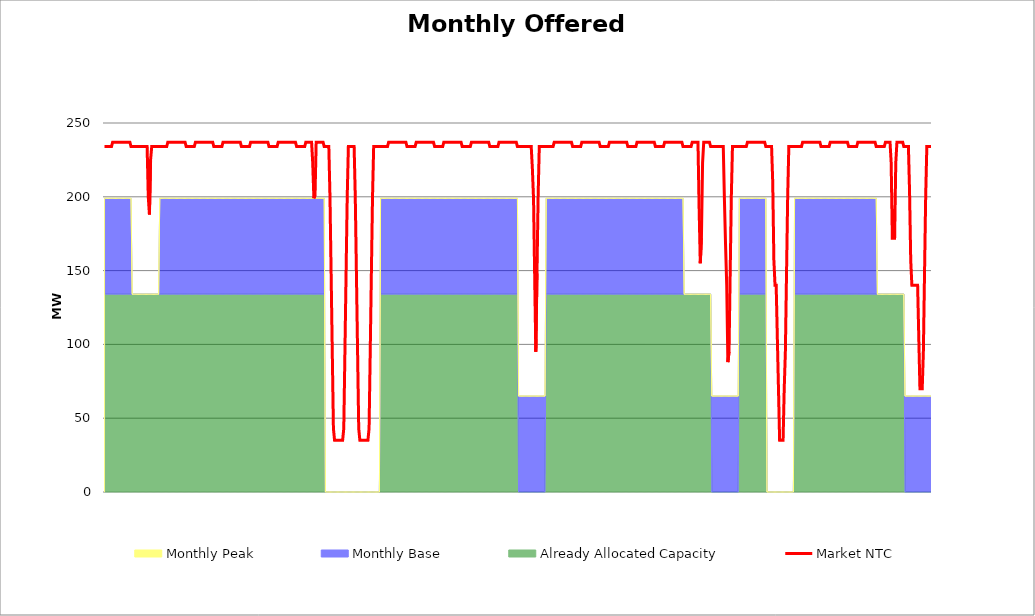
| Category | Market NTC |
|---|---|
| 0 | 234 |
| 1 | 234 |
| 2 | 234 |
| 3 | 234 |
| 4 | 234 |
| 5 | 234 |
| 6 | 234 |
| 7 | 237 |
| 8 | 237 |
| 9 | 237 |
| 10 | 237 |
| 11 | 237 |
| 12 | 237 |
| 13 | 237 |
| 14 | 237 |
| 15 | 237 |
| 16 | 237 |
| 17 | 237 |
| 18 | 237 |
| 19 | 237 |
| 20 | 237 |
| 21 | 237 |
| 22 | 237 |
| 23 | 234 |
| 24 | 234 |
| 25 | 234 |
| 26 | 234 |
| 27 | 234 |
| 28 | 234 |
| 29 | 234 |
| 30 | 234 |
| 31 | 234 |
| 32 | 234 |
| 33 | 234 |
| 34 | 234 |
| 35 | 234 |
| 36 | 234 |
| 37 | 234 |
| 38 | 200 |
| 39 | 188 |
| 40 | 225 |
| 41 | 234 |
| 42 | 234 |
| 43 | 234 |
| 44 | 234 |
| 45 | 234 |
| 46 | 234 |
| 47 | 234 |
| 48 | 234 |
| 49 | 234 |
| 50 | 234 |
| 51 | 234 |
| 52 | 234 |
| 53 | 234 |
| 54 | 234 |
| 55 | 237 |
| 56 | 237 |
| 57 | 237 |
| 58 | 237 |
| 59 | 237 |
| 60 | 237 |
| 61 | 237 |
| 62 | 237 |
| 63 | 237 |
| 64 | 237 |
| 65 | 237 |
| 66 | 237 |
| 67 | 237 |
| 68 | 237 |
| 69 | 237 |
| 70 | 237 |
| 71 | 234 |
| 72 | 234 |
| 73 | 234 |
| 74 | 234 |
| 75 | 234 |
| 76 | 234 |
| 77 | 234 |
| 78 | 234 |
| 79 | 237 |
| 80 | 237 |
| 81 | 237 |
| 82 | 237 |
| 83 | 237 |
| 84 | 237 |
| 85 | 237 |
| 86 | 237 |
| 87 | 237 |
| 88 | 237 |
| 89 | 237 |
| 90 | 237 |
| 91 | 237 |
| 92 | 237 |
| 93 | 237 |
| 94 | 237 |
| 95 | 234 |
| 96 | 234 |
| 97 | 234 |
| 98 | 234 |
| 99 | 234 |
| 100 | 234 |
| 101 | 234 |
| 102 | 234 |
| 103 | 237 |
| 104 | 237 |
| 105 | 237 |
| 106 | 237 |
| 107 | 237 |
| 108 | 237 |
| 109 | 237 |
| 110 | 237 |
| 111 | 237 |
| 112 | 237 |
| 113 | 237 |
| 114 | 237 |
| 115 | 237 |
| 116 | 237 |
| 117 | 237 |
| 118 | 237 |
| 119 | 234 |
| 120 | 234 |
| 121 | 234 |
| 122 | 234 |
| 123 | 234 |
| 124 | 234 |
| 125 | 234 |
| 126 | 234 |
| 127 | 237 |
| 128 | 237 |
| 129 | 237 |
| 130 | 237 |
| 131 | 237 |
| 132 | 237 |
| 133 | 237 |
| 134 | 237 |
| 135 | 237 |
| 136 | 237 |
| 137 | 237 |
| 138 | 237 |
| 139 | 237 |
| 140 | 237 |
| 141 | 237 |
| 142 | 237 |
| 143 | 234 |
| 144 | 234 |
| 145 | 234 |
| 146 | 234 |
| 147 | 234 |
| 148 | 234 |
| 149 | 234 |
| 150 | 234 |
| 151 | 237 |
| 152 | 237 |
| 153 | 237 |
| 154 | 237 |
| 155 | 237 |
| 156 | 237 |
| 157 | 237 |
| 158 | 237 |
| 159 | 237 |
| 160 | 237 |
| 161 | 237 |
| 162 | 237 |
| 163 | 237 |
| 164 | 237 |
| 165 | 237 |
| 166 | 237 |
| 167 | 234 |
| 168 | 234 |
| 169 | 234 |
| 170 | 234 |
| 171 | 234 |
| 172 | 234 |
| 173 | 234 |
| 174 | 234 |
| 175 | 237 |
| 176 | 237 |
| 177 | 237 |
| 178 | 237 |
| 179 | 237 |
| 180 | 237 |
| 181 | 223 |
| 182 | 199 |
| 183 | 201 |
| 184 | 237 |
| 185 | 237 |
| 186 | 237 |
| 187 | 237 |
| 188 | 237 |
| 189 | 237 |
| 190 | 237 |
| 191 | 234 |
| 192 | 234 |
| 193 | 234 |
| 194 | 234 |
| 195 | 234 |
| 196 | 200 |
| 197 | 148 |
| 198 | 95 |
| 199 | 43 |
| 200 | 35 |
| 201 | 35 |
| 202 | 35 |
| 203 | 35 |
| 204 | 35 |
| 205 | 35 |
| 206 | 35 |
| 207 | 35 |
| 208 | 43 |
| 209 | 95 |
| 210 | 148 |
| 211 | 200 |
| 212 | 234 |
| 213 | 234 |
| 214 | 234 |
| 215 | 234 |
| 216 | 234 |
| 217 | 234 |
| 218 | 200 |
| 219 | 148 |
| 220 | 95 |
| 221 | 43 |
| 222 | 35 |
| 223 | 35 |
| 224 | 35 |
| 225 | 35 |
| 226 | 35 |
| 227 | 35 |
| 228 | 35 |
| 229 | 35 |
| 230 | 43 |
| 231 | 95 |
| 232 | 148 |
| 233 | 200 |
| 234 | 234 |
| 235 | 234 |
| 236 | 234 |
| 237 | 234 |
| 238 | 234 |
| 239 | 234 |
| 240 | 234 |
| 241 | 234 |
| 242 | 234 |
| 243 | 234 |
| 244 | 234 |
| 245 | 234 |
| 246 | 234 |
| 247 | 237 |
| 248 | 237 |
| 249 | 237 |
| 250 | 237 |
| 251 | 237 |
| 252 | 237 |
| 253 | 237 |
| 254 | 237 |
| 255 | 237 |
| 256 | 237 |
| 257 | 237 |
| 258 | 237 |
| 259 | 237 |
| 260 | 237 |
| 261 | 237 |
| 262 | 237 |
| 263 | 234 |
| 264 | 234 |
| 265 | 234 |
| 266 | 234 |
| 267 | 234 |
| 268 | 234 |
| 269 | 234 |
| 270 | 234 |
| 271 | 237 |
| 272 | 237 |
| 273 | 237 |
| 274 | 237 |
| 275 | 237 |
| 276 | 237 |
| 277 | 237 |
| 278 | 237 |
| 279 | 237 |
| 280 | 237 |
| 281 | 237 |
| 282 | 237 |
| 283 | 237 |
| 284 | 237 |
| 285 | 237 |
| 286 | 237 |
| 287 | 234 |
| 288 | 234 |
| 289 | 234 |
| 290 | 234 |
| 291 | 234 |
| 292 | 234 |
| 293 | 234 |
| 294 | 234 |
| 295 | 237 |
| 296 | 237 |
| 297 | 237 |
| 298 | 237 |
| 299 | 237 |
| 300 | 237 |
| 301 | 237 |
| 302 | 237 |
| 303 | 237 |
| 304 | 237 |
| 305 | 237 |
| 306 | 237 |
| 307 | 237 |
| 308 | 237 |
| 309 | 237 |
| 310 | 237 |
| 311 | 234 |
| 312 | 234 |
| 313 | 234 |
| 314 | 234 |
| 315 | 234 |
| 316 | 234 |
| 317 | 234 |
| 318 | 234 |
| 319 | 237 |
| 320 | 237 |
| 321 | 237 |
| 322 | 237 |
| 323 | 237 |
| 324 | 237 |
| 325 | 237 |
| 326 | 237 |
| 327 | 237 |
| 328 | 237 |
| 329 | 237 |
| 330 | 237 |
| 331 | 237 |
| 332 | 237 |
| 333 | 237 |
| 334 | 237 |
| 335 | 234 |
| 336 | 234 |
| 337 | 234 |
| 338 | 234 |
| 339 | 234 |
| 340 | 234 |
| 341 | 234 |
| 342 | 234 |
| 343 | 237 |
| 344 | 237 |
| 345 | 237 |
| 346 | 237 |
| 347 | 237 |
| 348 | 237 |
| 349 | 237 |
| 350 | 237 |
| 351 | 237 |
| 352 | 237 |
| 353 | 237 |
| 354 | 237 |
| 355 | 237 |
| 356 | 237 |
| 357 | 237 |
| 358 | 237 |
| 359 | 234 |
| 360 | 234 |
| 361 | 234 |
| 362 | 234 |
| 363 | 234 |
| 364 | 234 |
| 365 | 234 |
| 366 | 234 |
| 367 | 234 |
| 368 | 234 |
| 369 | 234 |
| 370 | 234 |
| 371 | 234 |
| 372 | 219 |
| 373 | 199 |
| 374 | 146 |
| 375 | 95 |
| 376 | 148 |
| 377 | 200 |
| 378 | 234 |
| 379 | 234 |
| 380 | 234 |
| 381 | 234 |
| 382 | 234 |
| 383 | 234 |
| 384 | 234 |
| 385 | 234 |
| 386 | 234 |
| 387 | 234 |
| 388 | 234 |
| 389 | 234 |
| 390 | 234 |
| 391 | 237 |
| 392 | 237 |
| 393 | 237 |
| 394 | 237 |
| 395 | 237 |
| 396 | 237 |
| 397 | 237 |
| 398 | 237 |
| 399 | 237 |
| 400 | 237 |
| 401 | 237 |
| 402 | 237 |
| 403 | 237 |
| 404 | 237 |
| 405 | 237 |
| 406 | 237 |
| 407 | 234 |
| 408 | 234 |
| 409 | 234 |
| 410 | 234 |
| 411 | 234 |
| 412 | 234 |
| 413 | 234 |
| 414 | 234 |
| 415 | 237 |
| 416 | 237 |
| 417 | 237 |
| 418 | 237 |
| 419 | 237 |
| 420 | 237 |
| 421 | 237 |
| 422 | 237 |
| 423 | 237 |
| 424 | 237 |
| 425 | 237 |
| 426 | 237 |
| 427 | 237 |
| 428 | 237 |
| 429 | 237 |
| 430 | 237 |
| 431 | 234 |
| 432 | 234 |
| 433 | 234 |
| 434 | 234 |
| 435 | 234 |
| 436 | 234 |
| 437 | 234 |
| 438 | 234 |
| 439 | 237 |
| 440 | 237 |
| 441 | 237 |
| 442 | 237 |
| 443 | 237 |
| 444 | 237 |
| 445 | 237 |
| 446 | 237 |
| 447 | 237 |
| 448 | 237 |
| 449 | 237 |
| 450 | 237 |
| 451 | 237 |
| 452 | 237 |
| 453 | 237 |
| 454 | 237 |
| 455 | 234 |
| 456 | 234 |
| 457 | 234 |
| 458 | 234 |
| 459 | 234 |
| 460 | 234 |
| 461 | 234 |
| 462 | 234 |
| 463 | 237 |
| 464 | 237 |
| 465 | 237 |
| 466 | 237 |
| 467 | 237 |
| 468 | 237 |
| 469 | 237 |
| 470 | 237 |
| 471 | 237 |
| 472 | 237 |
| 473 | 237 |
| 474 | 237 |
| 475 | 237 |
| 476 | 237 |
| 477 | 237 |
| 478 | 237 |
| 479 | 234 |
| 480 | 234 |
| 481 | 234 |
| 482 | 234 |
| 483 | 234 |
| 484 | 234 |
| 485 | 234 |
| 486 | 234 |
| 487 | 237 |
| 488 | 237 |
| 489 | 237 |
| 490 | 237 |
| 491 | 237 |
| 492 | 237 |
| 493 | 237 |
| 494 | 237 |
| 495 | 237 |
| 496 | 237 |
| 497 | 237 |
| 498 | 237 |
| 499 | 237 |
| 500 | 237 |
| 501 | 237 |
| 502 | 237 |
| 503 | 234 |
| 504 | 234 |
| 505 | 234 |
| 506 | 234 |
| 507 | 234 |
| 508 | 234 |
| 509 | 234 |
| 510 | 234 |
| 511 | 237 |
| 512 | 237 |
| 513 | 237 |
| 514 | 237 |
| 515 | 237 |
| 516 | 237 |
| 517 | 192 |
| 518 | 155 |
| 519 | 172 |
| 520 | 223 |
| 521 | 237 |
| 522 | 237 |
| 523 | 237 |
| 524 | 237 |
| 525 | 237 |
| 526 | 237 |
| 527 | 234 |
| 528 | 234 |
| 529 | 234 |
| 530 | 234 |
| 531 | 234 |
| 532 | 234 |
| 533 | 234 |
| 534 | 234 |
| 535 | 234 |
| 536 | 234 |
| 537 | 234 |
| 538 | 234 |
| 539 | 198 |
| 540 | 167 |
| 541 | 140 |
| 542 | 88 |
| 543 | 95 |
| 544 | 148 |
| 545 | 200 |
| 546 | 234 |
| 547 | 234 |
| 548 | 234 |
| 549 | 234 |
| 550 | 234 |
| 551 | 234 |
| 552 | 234 |
| 553 | 234 |
| 554 | 234 |
| 555 | 234 |
| 556 | 234 |
| 557 | 234 |
| 558 | 234 |
| 559 | 237 |
| 560 | 237 |
| 561 | 237 |
| 562 | 237 |
| 563 | 237 |
| 564 | 237 |
| 565 | 237 |
| 566 | 237 |
| 567 | 237 |
| 568 | 237 |
| 569 | 237 |
| 570 | 237 |
| 571 | 237 |
| 572 | 237 |
| 573 | 237 |
| 574 | 237 |
| 575 | 234 |
| 576 | 234 |
| 577 | 234 |
| 578 | 234 |
| 579 | 234 |
| 580 | 234 |
| 581 | 210 |
| 582 | 157 |
| 583 | 140 |
| 584 | 140 |
| 585 | 105 |
| 586 | 70 |
| 587 | 35 |
| 588 | 35 |
| 589 | 35 |
| 590 | 35 |
| 591 | 70 |
| 592 | 95 |
| 593 | 148 |
| 594 | 200 |
| 595 | 234 |
| 596 | 234 |
| 597 | 234 |
| 598 | 234 |
| 599 | 234 |
| 600 | 234 |
| 601 | 234 |
| 602 | 234 |
| 603 | 234 |
| 604 | 234 |
| 605 | 234 |
| 606 | 234 |
| 607 | 237 |
| 608 | 237 |
| 609 | 237 |
| 610 | 237 |
| 611 | 237 |
| 612 | 237 |
| 613 | 237 |
| 614 | 237 |
| 615 | 237 |
| 616 | 237 |
| 617 | 237 |
| 618 | 237 |
| 619 | 237 |
| 620 | 237 |
| 621 | 237 |
| 622 | 237 |
| 623 | 234 |
| 624 | 234 |
| 625 | 234 |
| 626 | 234 |
| 627 | 234 |
| 628 | 234 |
| 629 | 234 |
| 630 | 234 |
| 631 | 237 |
| 632 | 237 |
| 633 | 237 |
| 634 | 237 |
| 635 | 237 |
| 636 | 237 |
| 637 | 237 |
| 638 | 237 |
| 639 | 237 |
| 640 | 237 |
| 641 | 237 |
| 642 | 237 |
| 643 | 237 |
| 644 | 237 |
| 645 | 237 |
| 646 | 237 |
| 647 | 234 |
| 648 | 234 |
| 649 | 234 |
| 650 | 234 |
| 651 | 234 |
| 652 | 234 |
| 653 | 234 |
| 654 | 234 |
| 655 | 237 |
| 656 | 237 |
| 657 | 237 |
| 658 | 237 |
| 659 | 237 |
| 660 | 237 |
| 661 | 237 |
| 662 | 237 |
| 663 | 237 |
| 664 | 237 |
| 665 | 237 |
| 666 | 237 |
| 667 | 237 |
| 668 | 237 |
| 669 | 237 |
| 670 | 237 |
| 671 | 234 |
| 672 | 234 |
| 673 | 234 |
| 674 | 234 |
| 675 | 234 |
| 676 | 234 |
| 677 | 234 |
| 678 | 234 |
| 679 | 237 |
| 680 | 237 |
| 681 | 237 |
| 682 | 237 |
| 683 | 237 |
| 684 | 223 |
| 685 | 172 |
| 686 | 172 |
| 687 | 172 |
| 688 | 223 |
| 689 | 237 |
| 690 | 237 |
| 691 | 237 |
| 692 | 237 |
| 693 | 237 |
| 694 | 237 |
| 695 | 234 |
| 696 | 234 |
| 697 | 234 |
| 698 | 234 |
| 699 | 234 |
| 700 | 203 |
| 701 | 157 |
| 702 | 140 |
| 703 | 140 |
| 704 | 140 |
| 705 | 140 |
| 706 | 140 |
| 707 | 140 |
| 708 | 105 |
| 709 | 70 |
| 710 | 70 |
| 711 | 70 |
| 712 | 95 |
| 713 | 148 |
| 714 | 200 |
| 715 | 234 |
| 716 | 234 |
| 717 | 234 |
| 718 | 234 |
| 719 | 234 |